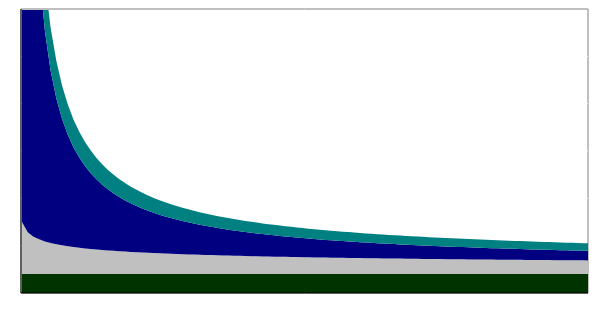
| Category | Material-kostnad | Genomsnittlig arbetskostnad* | Engångs-kostnad | Vinst-marginal |
|---|---|---|---|---|
| 0 | 20 | 55 | 2000 | 415 |
| 1 | 20 | 44.077 | 666.667 | 145.056 |
| 2 | 20 | 39.55 | 400 | 90.552 |
| 3 | 20 | 36.649 | 285.714 | 67.022 |
| 4 | 20 | 34.53 | 222.222 | 53.867 |
| 5 | 20 | 32.873 | 181.818 | 45.447 |
| 6 | 20 | 31.521 | 153.846 | 39.586 |
| 7 | 20 | 30.385 | 133.333 | 35.267 |
| 8 | 20 | 29.409 | 117.647 | 31.948 |
| 9 | 20 | 28.557 | 105.263 | 29.316 |
| 10 | 20 | 27.803 | 95.238 | 27.176 |
| 11 | 20 | 27.129 | 86.957 | 25.4 |
| 12 | 20 | 26.519 | 80 | 23.903 |
| 13 | 20 | 25.965 | 74.074 | 22.622 |
| 14 | 20 | 25.457 | 68.966 | 21.514 |
| 15 | 20 | 24.99 | 64.516 | 20.545 |
| 16 | 20 | 24.557 | 60.606 | 19.69 |
| 17 | 20 | 24.154 | 57.143 | 18.931 |
| 18 | 20 | 23.778 | 54.054 | 18.251 |
| 19 | 20 | 23.426 | 51.282 | 17.638 |
| 20 | 20 | 23.095 | 48.78 | 17.084 |
| 21 | 20 | 22.783 | 46.512 | 16.58 |
| 22 | 20 | 22.488 | 44.444 | 16.119 |
| 23 | 20 | 22.209 | 42.553 | 15.696 |
| 24 | 20 | 21.944 | 40.816 | 15.306 |
| 25 | 20 | 21.691 | 39.216 | 14.945 |
| 26 | 20 | 21.451 | 37.736 | 14.611 |
| 27 | 20 | 21.221 | 36.364 | 14.3 |
| 28 | 20 | 21.002 | 35.088 | 14.011 |
| 29 | 20 | 20.792 | 33.898 | 13.74 |
| 30 | 20 | 20.59 | 32.787 | 13.486 |
| 31 | 20 | 20.396 | 31.746 | 13.247 |
| 32 | 20 | 20.21 | 30.769 | 13.023 |
| 33 | 20 | 20.031 | 29.851 | 12.812 |
| 34 | 20 | 19.858 | 28.986 | 12.612 |
| 35 | 20 | 19.692 | 28.169 | 12.423 |
| 36 | 20 | 19.531 | 27.397 | 12.243 |
| 37 | 20 | 19.375 | 26.667 | 12.073 |
| 38 | 20 | 19.225 | 25.974 | 11.912 |
| 39 | 20 | 19.079 | 25.316 | 11.758 |
| 40 | 20 | 18.938 | 24.691 | 11.611 |
| 41 | 20 | 18.801 | 24.096 | 11.471 |
| 42 | 20 | 18.669 | 23.529 | 11.338 |
| 43 | 20 | 18.54 | 22.989 | 11.21 |
| 44 | 20 | 18.415 | 22.472 | 11.088 |
| 45 | 20 | 18.293 | 21.978 | 10.97 |
| 46 | 20 | 18.174 | 21.505 | 10.858 |
| 47 | 20 | 18.059 | 21.053 | 10.75 |
| 48 | 20 | 17.947 | 20.619 | 10.646 |
| 49 | 20 | 17.837 | 20.202 | 10.546 |
| 50 | 20 | 17.73 | 19.802 | 10.45 |
| 51 | 20 | 17.626 | 19.417 | 10.358 |
| 52 | 20 | 17.525 | 19.048 | 10.268 |
| 53 | 20 | 17.426 | 18.692 | 10.182 |
| 54 | 20 | 17.329 | 18.349 | 10.099 |
| 55 | 20 | 17.234 | 18.018 | 10.019 |
| 56 | 20 | 17.142 | 17.699 | 9.941 |
| 57 | 20 | 17.051 | 17.391 | 9.866 |
| 58 | 20 | 16.963 | 17.094 | 9.793 |
| 59 | 20 | 16.876 | 16.807 | 9.723 |
| 60 | 20 | 16.791 | 16.529 | 9.655 |
| 61 | 20 | 16.708 | 16.26 | 9.589 |
| 62 | 20 | 16.627 | 16 | 9.525 |
| 63 | 20 | 16.547 | 15.748 | 9.462 |
| 64 | 20 | 16.469 | 15.504 | 9.402 |
| 65 | 20 | 16.392 | 15.267 | 9.343 |
| 66 | 20 | 16.317 | 15.038 | 9.286 |
| 67 | 20 | 16.243 | 14.815 | 9.231 |
| 68 | 20 | 16.171 | 14.599 | 9.177 |
| 69 | 20 | 16.1 | 14.388 | 9.124 |
| 70 | 20 | 16.03 | 14.184 | 9.073 |
| 71 | 20 | 15.962 | 13.986 | 9.023 |
| 72 | 20 | 15.894 | 13.793 | 8.975 |
| 73 | 20 | 15.828 | 13.605 | 8.927 |
| 74 | 20 | 15.763 | 13.423 | 8.881 |
| 75 | 20 | 15.699 | 13.245 | 8.836 |
| 76 | 20 | 15.636 | 13.072 | 8.792 |
| 77 | 20 | 15.574 | 12.903 | 8.75 |
| 78 | 20 | 15.514 | 12.739 | 8.708 |
| 79 | 20 | 15.454 | 12.579 | 8.667 |
| 80 | 20 | 15.395 | 12.422 | 8.627 |
| 81 | 20 | 15.337 | 12.27 | 8.588 |
| 82 | 20 | 15.28 | 12.121 | 8.55 |
| 83 | 20 | 15.224 | 11.976 | 8.513 |
| 84 | 20 | 15.168 | 11.834 | 8.476 |
| 85 | 20 | 15.114 | 11.696 | 8.441 |
| 86 | 20 | 15.06 | 11.561 | 8.406 |
| 87 | 20 | 15.007 | 11.429 | 8.372 |
| 88 | 20 | 14.955 | 11.299 | 8.338 |
| 89 | 20 | 14.904 | 11.173 | 8.305 |
| 90 | 20 | 14.853 | 11.05 | 8.273 |
| 91 | 20 | 14.803 | 10.929 | 8.242 |
| 92 | 20 | 14.754 | 10.811 | 8.211 |
| 93 | 20 | 14.705 | 10.695 | 8.181 |
| 94 | 20 | 14.657 | 10.582 | 8.151 |
| 95 | 20 | 14.61 | 10.471 | 8.122 |
| 96 | 20 | 14.563 | 10.363 | 8.094 |
| 97 | 20 | 14.517 | 10.256 | 8.066 |
| 98 | 20 | 14.472 | 10.152 | 8.038 |
| 99 | 20 | 14.427 | 10.05 | 8.011 |